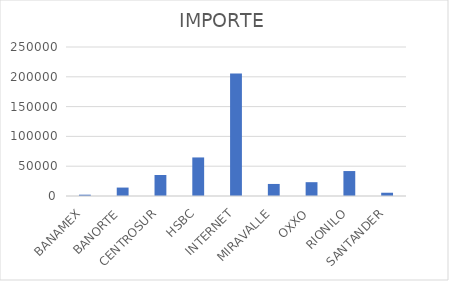
| Category | IMPORTE |
|---|---|
| BANAMEX | 2199.39 |
| BANORTE | 14145.14 |
| CENTROSUR | 35253 |
| HSBC | 64684.47 |
| INTERNET | 205563.5 |
| MIRAVALLE | 20218 |
| OXXO | 23184.69 |
| RIONILO | 41864 |
| SANTANDER | 5482.46 |